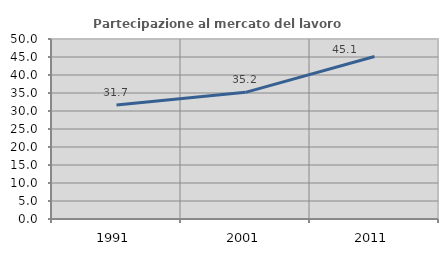
| Category | Partecipazione al mercato del lavoro  femminile |
|---|---|
| 1991.0 | 31.664 |
| 2001.0 | 35.184 |
| 2011.0 | 45.142 |